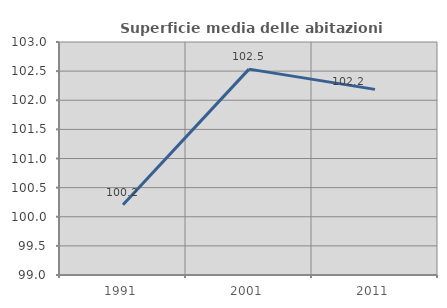
| Category | Superficie media delle abitazioni occupate |
|---|---|
| 1991.0 | 100.204 |
| 2001.0 | 102.534 |
| 2011.0 | 102.187 |